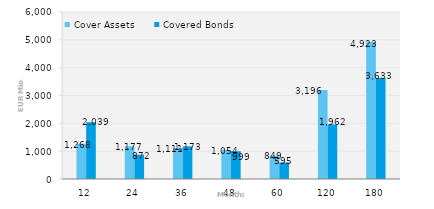
| Category | Cover Assets | Covered Bonds |
|---|---|---|
| 12.0 | 1267.765 | 2039 |
| 24.0 | 1176.588 | 872.074 |
| 36.0 | 1111.323 | 1173.15 |
| 48.0 | 1054.419 | 999.402 |
| 60.0 | 849.181 | 595.123 |
| 120.0 | 3195.721 | 1961.688 |
| 180.0 | 4923.454 | 3633.224 |